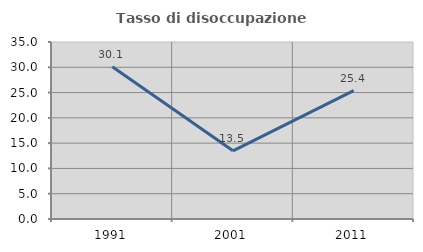
| Category | Tasso di disoccupazione giovanile  |
|---|---|
| 1991.0 | 30.114 |
| 2001.0 | 13.483 |
| 2011.0 | 25.373 |